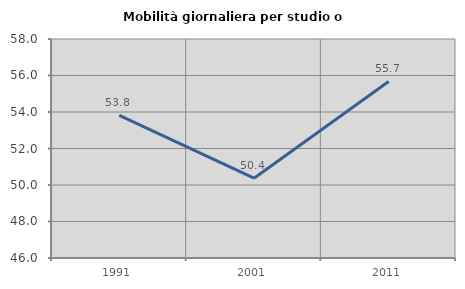
| Category | Mobilità giornaliera per studio o lavoro |
|---|---|
| 1991.0 | 53.815 |
| 2001.0 | 50.372 |
| 2011.0 | 55.675 |